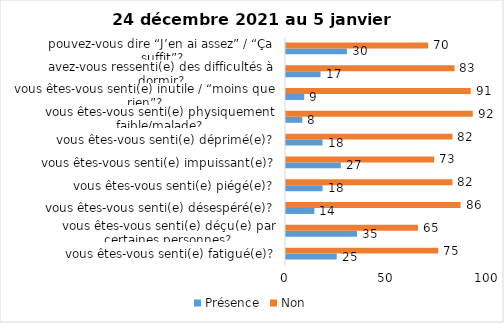
| Category | Présence | Non |
|---|---|---|
| vous êtes-vous senti(e) fatigué(e)? | 25 | 75 |
| vous êtes-vous senti(e) déçu(e) par certaines personnes? | 35 | 65 |
| vous êtes-vous senti(e) désespéré(e)? | 14 | 86 |
| vous êtes-vous senti(e) piégé(e)? | 18 | 82 |
| vous êtes-vous senti(e) impuissant(e)? | 27 | 73 |
| vous êtes-vous senti(e) déprimé(e)? | 18 | 82 |
| vous êtes-vous senti(e) physiquement faible/malade? | 8 | 92 |
| vous êtes-vous senti(e) inutile / “moins que rien”? | 9 | 91 |
| avez-vous ressenti(e) des difficultés à dormir? | 17 | 83 |
| pouvez-vous dire “J’en ai assez” / “Ça suffit”? | 30 | 70 |